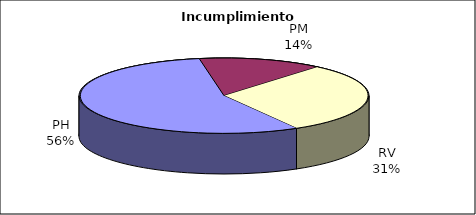
| Category | Valores |
|---|---|
| PH | 308 |
| PM | 77 |
| RV | 169 |